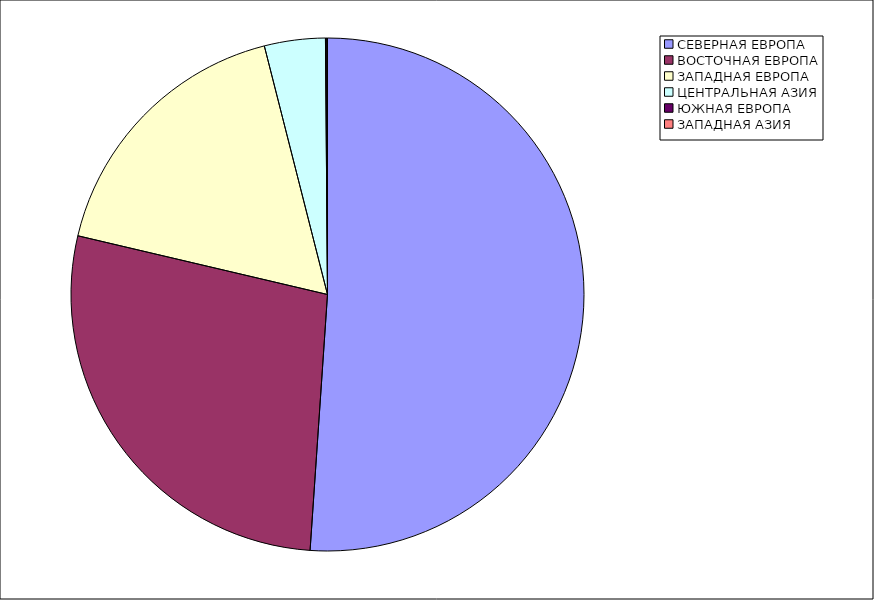
| Category | Оборот |
|---|---|
| СЕВЕРНАЯ ЕВРОПА | 51.082 |
| ВОСТОЧНАЯ ЕВРОПА | 27.594 |
| ЗАПАДНАЯ ЕВРОПА | 17.362 |
| ЦЕНТРАЛЬНАЯ АЗИЯ | 3.834 |
| ЮЖНАЯ ЕВРОПА | 0.083 |
| ЗАПАДНАЯ АЗИЯ | 0.045 |